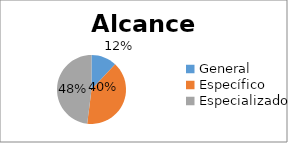
| Category | N° DOC |
|---|---|
| General | 3 |
| Específico | 10 |
| Especializado | 12 |